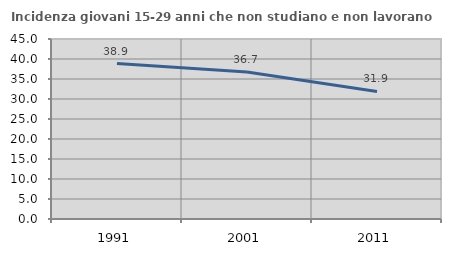
| Category | Incidenza giovani 15-29 anni che non studiano e non lavorano  |
|---|---|
| 1991.0 | 38.87 |
| 2001.0 | 36.726 |
| 2011.0 | 31.893 |